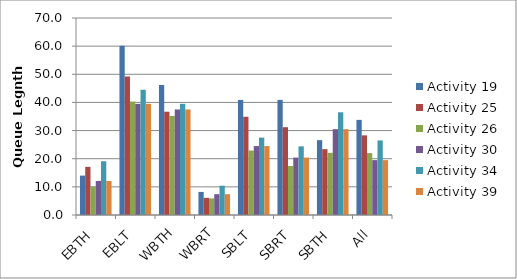
| Category | Activity 19 | Activity 25 | Activity 26 | Activity 30 | Activity 34 | Activity 39 |
|---|---|---|---|---|---|---|
| EBTH | 14 | 17.1 | 10.1 | 12.1 | 19.1 | 12.1 |
| EBLT | 60.1 | 49.2 | 40.3 | 39.5 | 44.5 | 39.5 |
| WBTH | 46.2 | 36.7 | 35.2 | 37.5 | 39.5 | 37.5 |
| WBRT | 8.2 | 6.1 | 5.9 | 7.4 | 10.4 | 7.4 |
| SBLT | 40.9 | 34.9 | 22.9 | 24.5 | 27.5 | 24.5 |
| SBRT | 40.9 | 31.2 | 17.4 | 20.4 | 24.4 | 20.4 |
| SBTH | 26.6 | 23.4 | 22.1 | 30.5 | 36.5 | 30.5 |
| All | 33.8 | 28.3 | 22 | 19.5 | 26.5 | 19.5 |